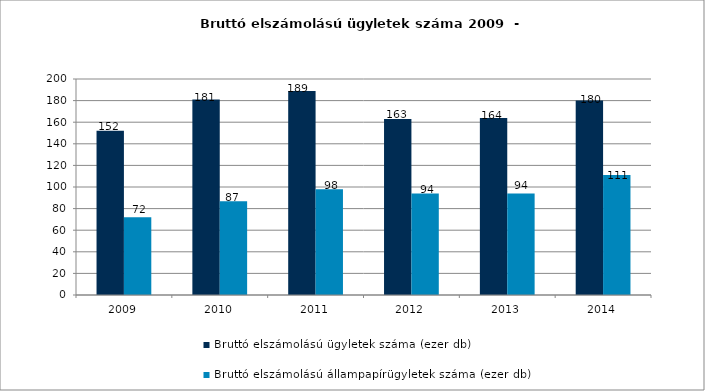
| Category | Bruttó elszámolású ügyletek száma (ezer db) | Bruttó elszámolású állampapírügyletek száma (ezer db) |
|---|---|---|
| 2009.0 | 152 | 72 |
| 2010.0 | 180.925 | 86.815 |
| 2011.0 | 189 | 98 |
| 2012.0 | 163 | 94 |
| 2013.0 | 164 | 94 |
| 2014.0 | 180 | 111 |